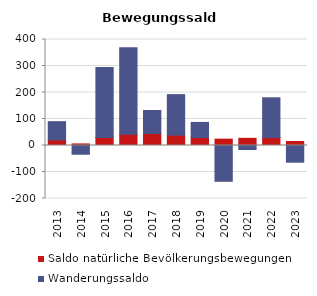
| Category | Saldo natürliche Bevölkerungsbewegungen | Wanderungssaldo |
|---|---|---|
| 2013.0 | 21 | 69 |
| 2014.0 | 6 | -33 |
| 2015.0 | 30 | 264 |
| 2016.0 | 42 | 327 |
| 2017.0 | 45 | 87 |
| 2018.0 | 39 | 153 |
| 2019.0 | 30 | 57 |
| 2020.0 | 24 | -135 |
| 2021.0 | 27 | -15 |
| 2022.0 | 30 | 150 |
| 2023.0 | 15 | -63 |